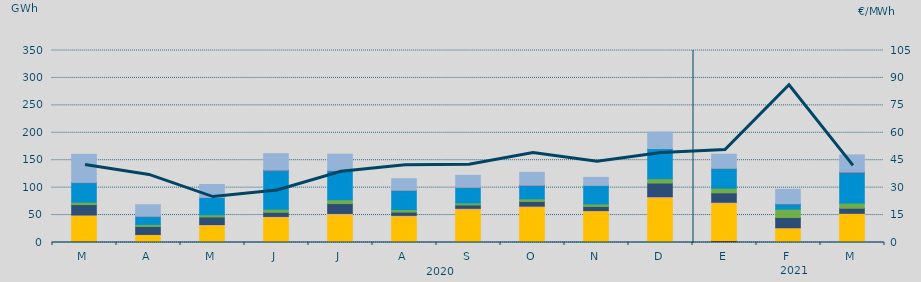
| Category | Carbón | Ciclo Combinado | Cogeneración | Consumo Bombeo | Eólica | Hidráulica | Nuclear | Otras Renovables | Solar fotovoltaica | Solar térmica | Turbinación bombeo |
|---|---|---|---|---|---|---|---|---|---|---|---|
| M | 2245.9 | 47824.7 | 73.5 | 18946.1 | 4359.7 | 35788.8 | 0 | 674.6 | 8.2 | 0 | 50742.6 |
| A | 0 | 14386.3 | 255.3 | 14671.4 | 3599.9 | 14970.4 | 0 | 474.6 | 1.7 | 0 | 20437.2 |
| M | 0 | 31710.8 | 991.1 | 13782.9 | 4057.5 | 31461.1 | 16.4 | 257 | 5.9 | 0 | 23468.1 |
| J | 82.3 | 46358.8 | 1092.1 | 7553.9 | 5342.6 | 71363.3 | 488.9 | 0.6 | 15.1 | 0 | 29619.5 |
| J | 41 | 51366.4 | 1567 | 17926.2 | 6971.2 | 53578.6 | 144 | 24.9 | 30.8 | 0 | 29400.3 |
| A | 6.7 | 48088.1 | 1369.2 | 5986.6 | 4572.9 | 35455.6 | 0 | 107.3 | 13.8 | 0 | 20673.5 |
| S | 54.7 | 60777.7 | 1507.9 | 6085.9 | 3725.9 | 28681.9 | 75 | 8 | 25.7 | 0 | 21527.4 |
| O | 27.3 | 65427.4 | 840.9 | 8534.6 | 4755.7 | 24804.7 | 0 | 0 | 8 | 2.5 | 23457.4 |
| N | 575.3 | 57009.7 | 618 | 7516.8 | 4494.6 | 33922.4 | 5.6 | 0.3 | 7.2 | 0 | 14589.5 |
| D | 160.3 | 81818 | 1565.6 | 24860.4 | 7908.5 | 54934.2 | 0 | 0 | 16.2 | 0 | 29926.3 |
| E | 3748.2 | 68568.9 | 1069.7 | 17152.7 | 8410.7 | 36501.6 | 0 | 0 | 17.1 | 0 | 25434.1 |
| F | 157.3 | 26400.8 | 340.9 | 18712.8 | 15219.5 | 9567.8 | 385.9 | 10.9 | 5.9 | 0 | 26182.8 |
| M | 78 | 53067.4 | 76.2 | 9280.8 | 9333.3 | 56450.9 | 0 | 0 | 10.4 | 1.5 | 31341 |